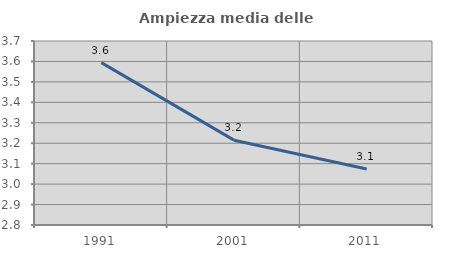
| Category | Ampiezza media delle famiglie |
|---|---|
| 1991.0 | 3.594 |
| 2001.0 | 3.215 |
| 2011.0 | 3.074 |